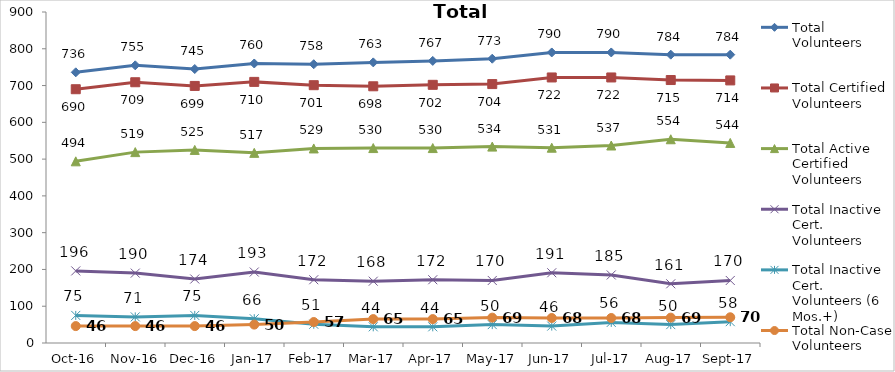
| Category | Total Volunteers | Total Certified Volunteers | Total Active Certified Volunteers | Total Inactive Cert. Volunteers | Total Inactive Cert. Volunteers (6 Mos.+) | Total Non-Case Volunteers |
|---|---|---|---|---|---|---|
| 2016-10-01 | 736 | 690 | 494 | 196 | 75 | 46 |
| 2016-11-01 | 755 | 709 | 519 | 190 | 71 | 46 |
| 2016-12-01 | 745 | 699 | 525 | 174 | 75 | 46 |
| 2017-01-01 | 760 | 710 | 517 | 193 | 66 | 50 |
| 2017-02-01 | 758 | 701 | 529 | 172 | 51 | 57 |
| 2017-03-01 | 763 | 698 | 530 | 168 | 44 | 65 |
| 2017-04-01 | 767 | 702 | 530 | 172 | 44 | 65 |
| 2017-05-01 | 773 | 704 | 534 | 170 | 50 | 69 |
| 2017-06-01 | 790 | 722 | 531 | 191 | 46 | 68 |
| 2017-07-01 | 790 | 722 | 537 | 185 | 56 | 68 |
| 2017-08-01 | 784 | 715 | 554 | 161 | 50 | 69 |
| 2017-09-01 | 784 | 714 | 544 | 170 | 58 | 70 |